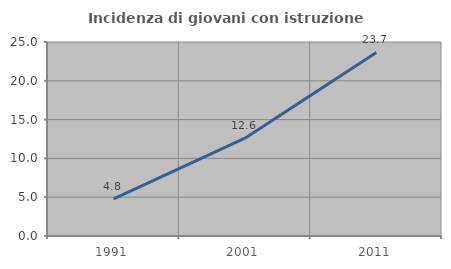
| Category | Incidenza di giovani con istruzione universitaria |
|---|---|
| 1991.0 | 4.797 |
| 2001.0 | 12.607 |
| 2011.0 | 23.656 |